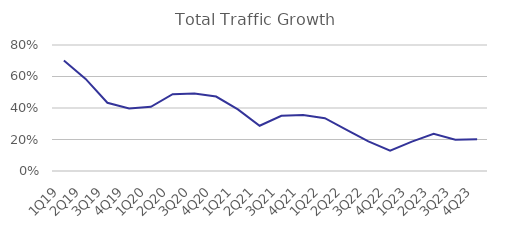
| Category | Total Traffic Growth |
|---|---|
| 1Q19 | 0.702 |
| 2Q19 | 0.585 |
| 3Q19 | 0.433 |
| 4Q19 | 0.397 |
| 1Q20 | 0.408 |
| 2Q20 | 0.488 |
| 3Q20 | 0.491 |
| 4Q20 | 0.473 |
| 1Q21 | 0.391 |
| 2Q21 | 0.287 |
| 3Q21 | 0.351 |
| 4Q21 | 0.355 |
| 1Q22 | 0.335 |
| 2Q22 | 0.261 |
| 3Q22 | 0.188 |
| 4Q22 | 0.129 |
| 1Q23 | 0.187 |
| 2Q23 | 0.237 |
| 3Q23 | 0.199 |
| 4Q23 | 0.201 |